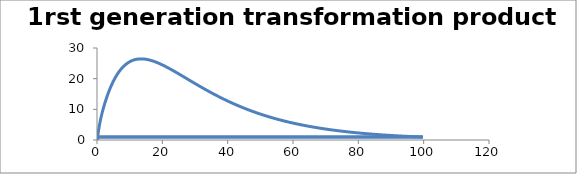
| Category | C - Sys 2 |
|---|---|
| 0.1 | 0 |
| 0.2 | 0.948 |
| 0.3 | 1.804 |
| 0.4 | 2.583 |
| 0.5 | 3.3 |
| 0.6 | 3.963 |
| 0.7000000000000001 | 4.582 |
| 0.8 | 5.163 |
| 0.9000000000000001 | 5.713 |
| 1.0 | 6.236 |
| 1.0999999999999999 | 6.736 |
| 1.2 | 7.215 |
| 1.3 | 7.677 |
| 1.4000000000000001 | 8.123 |
| 1.5 | 8.556 |
| 1.6 | 8.976 |
| 1.7000000000000002 | 9.385 |
| 1.8000000000000003 | 9.784 |
| 1.9 | 10.174 |
| 2.0 | 10.554 |
| 2.1 | 10.926 |
| 2.1999999999999997 | 11.291 |
| 2.3 | 11.648 |
| 2.4 | 11.998 |
| 2.5 | 12.342 |
| 2.6 | 12.679 |
| 2.7 | 13.009 |
| 2.8000000000000003 | 13.334 |
| 2.9000000000000004 | 13.652 |
| 3.0 | 13.965 |
| 3.1 | 14.272 |
| 3.2 | 14.573 |
| 3.3000000000000003 | 14.869 |
| 3.4000000000000004 | 15.16 |
| 3.5000000000000004 | 15.445 |
| 3.6000000000000005 | 15.725 |
| 3.6999999999999997 | 16 |
| 3.8 | 16.27 |
| 3.9 | 16.535 |
| 4.0 | 16.795 |
| 4.1000000000000005 | 17.051 |
| 4.2 | 17.301 |
| 4.300000000000001 | 17.547 |
| 4.3999999999999995 | 17.789 |
| 4.5 | 18.025 |
| 4.6 | 18.258 |
| 4.7 | 18.485 |
| 4.8 | 18.709 |
| 4.9 | 18.928 |
| 5.0 | 19.143 |
| 5.1000000000000005 | 19.354 |
| 5.2 | 19.56 |
| 5.3 | 19.763 |
| 5.4 | 19.961 |
| 5.5 | 20.155 |
| 5.6000000000000005 | 20.346 |
| 5.7 | 20.532 |
| 5.800000000000001 | 20.715 |
| 5.9 | 20.894 |
| 6.0 | 21.069 |
| 6.1 | 21.241 |
| 6.2 | 21.408 |
| 6.3 | 21.573 |
| 6.4 | 21.733 |
| 6.5 | 21.891 |
| 6.6000000000000005 | 22.044 |
| 6.7 | 22.195 |
| 6.800000000000001 | 22.342 |
| 6.9 | 22.485 |
| 7.000000000000001 | 22.626 |
| 7.1000000000000005 | 22.763 |
| 7.200000000000001 | 22.897 |
| 7.3 | 23.028 |
| 7.3999999999999995 | 23.155 |
| 7.5 | 23.28 |
| 7.6 | 23.402 |
| 7.7 | 23.52 |
| 7.8 | 23.636 |
| 7.9 | 23.749 |
| 8.0 | 23.859 |
| 8.1 | 23.966 |
| 8.200000000000001 | 24.07 |
| 8.3 | 24.172 |
| 8.4 | 24.27 |
| 8.5 | 24.367 |
| 8.600000000000001 | 24.46 |
| 8.700000000000001 | 24.551 |
| 8.799999999999999 | 24.639 |
| 8.9 | 24.725 |
| 9.0 | 24.808 |
| 9.1 | 24.889 |
| 9.2 | 24.968 |
| 9.3 | 25.044 |
| 9.4 | 25.117 |
| 9.5 | 25.188 |
| 9.6 | 25.257 |
| 9.700000000000001 | 25.324 |
| 9.8 | 25.389 |
| 9.9 | 25.451 |
| 10.0 | 25.511 |
| 10.100000000000001 | 25.569 |
| 10.200000000000001 | 25.625 |
| 10.3 | 25.678 |
| 10.4 | 25.73 |
| 10.5 | 25.78 |
| 10.6 | 25.827 |
| 10.7 | 25.873 |
| 10.8 | 25.917 |
| 10.9 | 25.959 |
| 11.0 | 25.998 |
| 11.1 | 26.037 |
| 11.200000000000001 | 26.073 |
| 11.3 | 26.107 |
| 11.4 | 26.14 |
| 11.5 | 26.171 |
| 11.600000000000001 | 26.2 |
| 11.700000000000001 | 26.227 |
| 11.8 | 26.253 |
| 11.9 | 26.277 |
| 12.0 | 26.299 |
| 12.1 | 26.32 |
| 12.2 | 26.339 |
| 12.3 | 26.357 |
| 12.4 | 26.373 |
| 12.5 | 26.388 |
| 12.6 | 26.401 |
| 12.7 | 26.413 |
| 12.8 | 26.423 |
| 12.9 | 26.431 |
| 13.0 | 26.439 |
| 13.100000000000001 | 26.445 |
| 13.200000000000001 | 26.449 |
| 13.3 | 26.453 |
| 13.4 | 26.455 |
| 13.5 | 26.455 |
| 13.600000000000001 | 26.454 |
| 13.700000000000001 | 26.453 |
| 13.8 | 26.449 |
| 13.900000000000002 | 26.445 |
| 14.000000000000002 | 26.439 |
| 14.100000000000001 | 26.433 |
| 14.200000000000001 | 26.425 |
| 14.3 | 26.415 |
| 14.400000000000002 | 26.405 |
| 14.499999999999998 | 26.394 |
| 14.6 | 26.381 |
| 14.7 | 26.368 |
| 14.799999999999999 | 26.353 |
| 14.899999999999999 | 26.337 |
| 15.0 | 26.321 |
| 15.1 | 26.303 |
| 15.2 | 26.284 |
| 15.299999999999999 | 26.264 |
| 15.4 | 26.244 |
| 15.5 | 26.222 |
| 15.6 | 26.2 |
| 15.7 | 26.176 |
| 15.8 | 26.152 |
| 15.9 | 26.126 |
| 16.0 | 26.1 |
| 16.1 | 26.073 |
| 16.2 | 26.045 |
| 16.3 | 26.017 |
| 16.400000000000002 | 25.987 |
| 16.5 | 25.957 |
| 16.6 | 25.926 |
| 16.7 | 25.894 |
| 16.8 | 25.861 |
| 16.900000000000002 | 25.828 |
| 17.0 | 25.794 |
| 17.1 | 25.759 |
| 17.200000000000003 | 25.723 |
| 17.3 | 25.687 |
| 17.400000000000002 | 25.65 |
| 17.5 | 25.612 |
| 17.599999999999998 | 25.574 |
| 17.7 | 25.535 |
| 17.8 | 25.496 |
| 17.9 | 25.455 |
| 18.0 | 25.414 |
| 18.099999999999998 | 25.373 |
| 18.2 | 25.331 |
| 18.3 | 25.288 |
| 18.4 | 25.245 |
| 18.5 | 25.202 |
| 18.6 | 25.157 |
| 18.7 | 25.112 |
| 18.8 | 25.067 |
| 18.9 | 25.021 |
| 19.0 | 24.975 |
| 19.1 | 24.928 |
| 19.2 | 24.881 |
| 19.3 | 24.833 |
| 19.400000000000002 | 24.785 |
| 19.5 | 24.736 |
| 19.6 | 24.687 |
| 19.7 | 24.637 |
| 19.8 | 24.587 |
| 19.900000000000002 | 24.536 |
| 20.0 | 24.485 |
| 20.1 | 24.434 |
| 20.200000000000003 | 24.382 |
| 20.3 | 24.33 |
| 20.400000000000002 | 24.278 |
| 20.5 | 24.225 |
| 20.6 | 24.172 |
| 20.700000000000003 | 24.118 |
| 20.8 | 24.064 |
| 20.9 | 24.01 |
| 21.0 | 23.955 |
| 21.099999999999998 | 23.9 |
| 21.2 | 23.845 |
| 21.3 | 23.79 |
| 21.4 | 23.734 |
| 21.5 | 23.678 |
| 21.6 | 23.621 |
| 21.7 | 23.565 |
| 21.8 | 23.508 |
| 21.9 | 23.45 |
| 22.0 | 23.393 |
| 22.1 | 23.335 |
| 22.2 | 23.277 |
| 22.3 | 23.219 |
| 22.400000000000002 | 23.16 |
| 22.5 | 23.102 |
| 22.6 | 23.043 |
| 22.7 | 22.984 |
| 22.8 | 22.924 |
| 22.900000000000002 | 22.865 |
| 23.0 | 22.805 |
| 23.1 | 22.745 |
| 23.200000000000003 | 22.685 |
| 23.3 | 22.625 |
| 23.400000000000002 | 22.564 |
| 23.5 | 22.504 |
| 23.6 | 22.443 |
| 23.700000000000003 | 22.382 |
| 23.8 | 22.321 |
| 23.900000000000002 | 22.26 |
| 24.0 | 22.198 |
| 24.099999999999998 | 22.137 |
| 24.2 | 22.075 |
| 24.3 | 22.014 |
| 24.4 | 21.952 |
| 24.5 | 21.89 |
| 24.6 | 21.828 |
| 24.7 | 21.765 |
| 24.8 | 21.703 |
| 24.9 | 21.641 |
| 25.0 | 21.578 |
| 25.1 | 21.516 |
| 25.2 | 21.453 |
| 25.3 | 21.39 |
| 25.4 | 21.327 |
| 25.5 | 21.264 |
| 25.6 | 21.201 |
| 25.7 | 21.138 |
| 25.8 | 21.075 |
| 25.900000000000002 | 21.012 |
| 26.0 | 20.949 |
| 26.1 | 20.886 |
| 26.200000000000003 | 20.823 |
| 26.3 | 20.759 |
| 26.400000000000002 | 20.696 |
| 26.5 | 20.632 |
| 26.6 | 20.569 |
| 26.700000000000003 | 20.506 |
| 26.8 | 20.442 |
| 26.900000000000002 | 20.379 |
| 27.0 | 20.315 |
| 27.1 | 20.252 |
| 27.200000000000003 | 20.188 |
| 27.3 | 20.125 |
| 27.400000000000002 | 20.061 |
| 27.500000000000004 | 19.998 |
| 27.6 | 19.934 |
| 27.700000000000003 | 19.871 |
| 27.800000000000004 | 19.807 |
| 27.900000000000002 | 19.744 |
| 28.000000000000004 | 19.68 |
| 28.1 | 19.617 |
| 28.200000000000003 | 19.553 |
| 28.300000000000004 | 19.49 |
| 28.400000000000002 | 19.426 |
| 28.500000000000004 | 19.363 |
| 28.6 | 19.3 |
| 28.700000000000003 | 19.236 |
| 28.800000000000004 | 19.173 |
| 28.9 | 19.11 |
| 28.999999999999996 | 19.047 |
| 29.099999999999998 | 18.984 |
| 29.2 | 18.921 |
| 29.299999999999997 | 18.858 |
| 29.4 | 18.795 |
| 29.5 | 18.732 |
| 29.599999999999998 | 18.669 |
| 29.7 | 18.606 |
| 29.799999999999997 | 18.543 |
| 29.9 | 18.481 |
| 30.0 | 18.418 |
| 30.099999999999998 | 18.356 |
| 30.2 | 18.293 |
| 30.3 | 18.231 |
| 30.4 | 18.168 |
| 30.5 | 18.106 |
| 30.599999999999998 | 18.044 |
| 30.7 | 17.982 |
| 30.8 | 17.92 |
| 30.9 | 17.858 |
| 31.0 | 17.796 |
| 31.1 | 17.734 |
| 31.2 | 17.672 |
| 31.3 | 17.611 |
| 31.4 | 17.549 |
| 31.5 | 17.488 |
| 31.6 | 17.427 |
| 31.7 | 17.365 |
| 31.8 | 17.304 |
| 31.900000000000002 | 17.243 |
| 32.0 | 17.182 |
| 32.1 | 17.121 |
| 32.2 | 17.061 |
| 32.300000000000004 | 17 |
| 32.4 | 16.939 |
| 32.5 | 16.879 |
| 32.6 | 16.819 |
| 32.7 | 16.758 |
| 32.800000000000004 | 16.698 |
| 32.9 | 16.638 |
| 33.0 | 16.579 |
| 33.1 | 16.519 |
| 33.2 | 16.459 |
| 33.300000000000004 | 16.4 |
| 33.4 | 16.34 |
| 33.5 | 16.281 |
| 33.6 | 16.222 |
| 33.7 | 16.163 |
| 33.800000000000004 | 16.104 |
| 33.900000000000006 | 16.045 |
| 34.0 | 15.986 |
| 34.1 | 15.928 |
| 34.2 | 15.869 |
| 34.300000000000004 | 15.811 |
| 34.400000000000006 | 15.753 |
| 34.5 | 15.695 |
| 34.6 | 15.637 |
| 34.7 | 15.579 |
| 34.800000000000004 | 15.521 |
| 34.900000000000006 | 15.464 |
| 35.0 | 15.406 |
| 35.1 | 15.349 |
| 35.199999999999996 | 15.292 |
| 35.3 | 15.235 |
| 35.4 | 15.178 |
| 35.5 | 15.121 |
| 35.6 | 15.065 |
| 35.699999999999996 | 15.008 |
| 35.8 | 14.952 |
| 35.9 | 14.896 |
| 36.0 | 14.839 |
| 36.1 | 14.784 |
| 36.199999999999996 | 14.728 |
| 36.3 | 14.672 |
| 36.4 | 14.617 |
| 36.5 | 14.561 |
| 36.6 | 14.506 |
| 36.7 | 14.451 |
| 36.8 | 14.396 |
| 36.9 | 14.341 |
| 37.0 | 14.287 |
| 37.1 | 14.232 |
| 37.2 | 14.178 |
| 37.3 | 14.124 |
| 37.4 | 14.07 |
| 37.5 | 14.016 |
| 37.6 | 13.962 |
| 37.7 | 13.908 |
| 37.8 | 13.855 |
| 37.9 | 13.801 |
| 38.0 | 13.748 |
| 38.1 | 13.695 |
| 38.2 | 13.642 |
| 38.3 | 13.59 |
| 38.4 | 13.537 |
| 38.5 | 13.485 |
| 38.6 | 13.432 |
| 38.7 | 13.38 |
| 38.800000000000004 | 13.328 |
| 38.9 | 13.276 |
| 39.0 | 13.225 |
| 39.1 | 13.173 |
| 39.2 | 13.122 |
| 39.300000000000004 | 13.07 |
| 39.4 | 13.019 |
| 39.5 | 12.968 |
| 39.6 | 12.918 |
| 39.7 | 12.867 |
| 39.800000000000004 | 12.817 |
| 39.900000000000006 | 12.766 |
| 40.0 | 12.716 |
| 40.1 | 12.666 |
| 40.2 | 12.616 |
| 40.300000000000004 | 12.566 |
| 40.400000000000006 | 12.517 |
| 40.5 | 12.467 |
| 40.6 | 12.418 |
| 40.7 | 12.369 |
| 40.800000000000004 | 12.32 |
| 40.900000000000006 | 12.271 |
| 41.0 | 12.223 |
| 41.1 | 12.174 |
| 41.2 | 12.126 |
| 41.300000000000004 | 12.078 |
| 41.400000000000006 | 12.03 |
| 41.5 | 11.982 |
| 41.6 | 11.934 |
| 41.699999999999996 | 11.886 |
| 41.8 | 11.839 |
| 41.9 | 11.792 |
| 42.0 | 11.744 |
| 42.1 | 11.697 |
| 42.199999999999996 | 11.651 |
| 42.3 | 11.604 |
| 42.4 | 11.557 |
| 42.5 | 11.511 |
| 42.6 | 11.465 |
| 42.699999999999996 | 11.419 |
| 42.8 | 11.373 |
| 42.9 | 11.327 |
| 43.0 | 11.282 |
| 43.1 | 11.236 |
| 43.2 | 11.191 |
| 43.3 | 11.146 |
| 43.4 | 11.101 |
| 43.5 | 11.056 |
| 43.6 | 11.011 |
| 43.7 | 10.966 |
| 43.8 | 10.922 |
| 43.9 | 10.878 |
| 44.0 | 10.834 |
| 44.1 | 10.79 |
| 44.2 | 10.746 |
| 44.3 | 10.702 |
| 44.4 | 10.659 |
| 44.5 | 10.615 |
| 44.6 | 10.572 |
| 44.7 | 10.529 |
| 44.800000000000004 | 10.486 |
| 44.9 | 10.444 |
| 45.0 | 10.401 |
| 45.1 | 10.358 |
| 45.2 | 10.316 |
| 45.300000000000004 | 10.274 |
| 45.4 | 10.232 |
| 45.5 | 10.19 |
| 45.6 | 10.148 |
| 45.7 | 10.107 |
| 45.800000000000004 | 10.065 |
| 45.9 | 10.024 |
| 46.0 | 9.983 |
| 46.1 | 9.942 |
| 46.2 | 9.901 |
| 46.300000000000004 | 9.86 |
| 46.400000000000006 | 9.82 |
| 46.5 | 9.779 |
| 46.6 | 9.739 |
| 46.7 | 9.699 |
| 46.800000000000004 | 9.659 |
| 46.900000000000006 | 9.619 |
| 47.0 | 9.58 |
| 47.1 | 9.54 |
| 47.2 | 9.501 |
| 47.300000000000004 | 9.461 |
| 47.400000000000006 | 9.422 |
| 47.5 | 9.383 |
| 47.6 | 9.344 |
| 47.7 | 9.306 |
| 47.800000000000004 | 9.267 |
| 47.900000000000006 | 9.229 |
| 48.0 | 9.19 |
| 48.1 | 9.152 |
| 48.199999999999996 | 9.114 |
| 48.3 | 9.077 |
| 48.4 | 9.039 |
| 48.5 | 9.001 |
| 48.6 | 8.964 |
| 48.699999999999996 | 8.926 |
| 48.8 | 8.889 |
| 48.9 | 8.852 |
| 49.0 | 8.815 |
| 49.1 | 8.779 |
| 49.2 | 8.742 |
| 49.3 | 8.706 |
| 49.4 | 8.669 |
| 49.5 | 8.633 |
| 49.6 | 8.597 |
| 49.7 | 8.561 |
| 49.8 | 8.525 |
| 49.9 | 8.49 |
| 50.0 | 8.454 |
| 50.1 | 8.419 |
| 50.2 | 8.383 |
| 50.3 | 8.348 |
| 50.4 | 8.313 |
| 50.5 | 8.279 |
| 50.6 | 8.244 |
| 50.7 | 8.209 |
| 50.8 | 8.175 |
| 50.9 | 8.14 |
| 51.0 | 8.106 |
| 51.1 | 8.072 |
| 51.2 | 8.038 |
| 51.300000000000004 | 8.004 |
| 51.4 | 7.971 |
| 51.5 | 7.937 |
| 51.6 | 7.904 |
| 51.7 | 7.87 |
| 51.800000000000004 | 7.837 |
| 51.9 | 7.804 |
| 52.0 | 7.771 |
| 52.1 | 7.739 |
| 52.2 | 7.706 |
| 52.300000000000004 | 7.673 |
| 52.400000000000006 | 7.641 |
| 52.5 | 7.609 |
| 52.6 | 7.577 |
| 52.7 | 7.545 |
| 52.800000000000004 | 7.513 |
| 52.900000000000006 | 7.481 |
| 53.0 | 7.449 |
| 53.1 | 7.418 |
| 53.2 | 7.386 |
| 53.300000000000004 | 7.355 |
| 53.400000000000006 | 7.324 |
| 53.5 | 7.293 |
| 53.6 | 7.262 |
| 53.7 | 7.231 |
| 53.800000000000004 | 7.2 |
| 53.900000000000006 | 7.17 |
| 54.0 | 7.139 |
| 54.1 | 7.109 |
| 54.2 | 7.079 |
| 54.300000000000004 | 7.049 |
| 54.400000000000006 | 7.019 |
| 54.50000000000001 | 6.989 |
| 54.6 | 6.959 |
| 54.7 | 6.93 |
| 54.800000000000004 | 6.9 |
| 54.900000000000006 | 6.871 |
| 55.00000000000001 | 6.842 |
| 55.1 | 6.812 |
| 55.2 | 6.783 |
| 55.300000000000004 | 6.755 |
| 55.400000000000006 | 6.726 |
| 55.50000000000001 | 6.697 |
| 55.60000000000001 | 6.669 |
| 55.7 | 6.64 |
| 55.800000000000004 | 6.612 |
| 55.900000000000006 | 6.584 |
| 56.00000000000001 | 6.555 |
| 56.10000000000001 | 6.527 |
| 56.2 | 6.5 |
| 56.300000000000004 | 6.472 |
| 56.400000000000006 | 6.444 |
| 56.50000000000001 | 6.417 |
| 56.60000000000001 | 6.389 |
| 56.7 | 6.362 |
| 56.800000000000004 | 6.335 |
| 56.900000000000006 | 6.307 |
| 57.00000000000001 | 6.28 |
| 57.10000000000001 | 6.254 |
| 57.2 | 6.227 |
| 57.300000000000004 | 6.2 |
| 57.400000000000006 | 6.174 |
| 57.50000000000001 | 6.147 |
| 57.60000000000001 | 6.121 |
| 57.699999999999996 | 6.095 |
| 57.8 | 6.068 |
| 57.9 | 6.042 |
| 57.99999999999999 | 6.016 |
| 58.099999999999994 | 5.991 |
| 58.199999999999996 | 5.965 |
| 58.3 | 5.939 |
| 58.4 | 5.914 |
| 58.5 | 5.888 |
| 58.599999999999994 | 5.863 |
| 58.699999999999996 | 5.838 |
| 58.8 | 5.813 |
| 58.9 | 5.788 |
| 59.0 | 5.763 |
| 59.099999999999994 | 5.738 |
| 59.199999999999996 | 5.713 |
| 59.3 | 5.689 |
| 59.4 | 5.664 |
| 59.5 | 5.64 |
| 59.599999999999994 | 5.616 |
| 59.699999999999996 | 5.591 |
| 59.8 | 5.567 |
| 59.9 | 5.543 |
| 60.0 | 5.52 |
| 60.099999999999994 | 5.496 |
| 60.199999999999996 | 5.472 |
| 60.3 | 5.448 |
| 60.4 | 5.425 |
| 60.5 | 5.402 |
| 60.6 | 5.378 |
| 60.699999999999996 | 5.355 |
| 60.8 | 5.332 |
| 60.9 | 5.309 |
| 61.0 | 5.286 |
| 61.1 | 5.263 |
| 61.199999999999996 | 5.24 |
| 61.3 | 5.218 |
| 61.4 | 5.195 |
| 61.5 | 5.173 |
| 61.6 | 5.15 |
| 61.7 | 5.128 |
| 61.8 | 5.106 |
| 61.9 | 5.084 |
| 62.0 | 5.062 |
| 62.1 | 5.04 |
| 62.2 | 5.018 |
| 62.3 | 4.996 |
| 62.4 | 4.975 |
| 62.5 | 4.953 |
| 62.6 | 4.932 |
| 62.7 | 4.91 |
| 62.8 | 4.889 |
| 62.9 | 4.868 |
| 63.0 | 4.847 |
| 63.1 | 4.826 |
| 63.2 | 4.805 |
| 63.3 | 4.784 |
| 63.4 | 4.763 |
| 63.5 | 4.743 |
| 63.6 | 4.722 |
| 63.7 | 4.702 |
| 63.800000000000004 | 4.681 |
| 63.9 | 4.661 |
| 64.0 | 4.641 |
| 64.1 | 4.621 |
| 64.2 | 4.601 |
| 64.3 | 4.581 |
| 64.4 | 4.561 |
| 64.5 | 4.541 |
| 64.60000000000001 | 4.521 |
| 64.7 | 4.502 |
| 64.8 | 4.482 |
| 64.9 | 4.462 |
| 65.0 | 4.443 |
| 65.10000000000001 | 4.424 |
| 65.2 | 4.405 |
| 65.3 | 4.385 |
| 65.4 | 4.366 |
| 65.5 | 4.347 |
| 65.60000000000001 | 4.328 |
| 65.7 | 4.31 |
| 65.8 | 4.291 |
| 65.9 | 4.272 |
| 66.0 | 4.254 |
| 66.10000000000001 | 4.235 |
| 66.2 | 4.217 |
| 66.3 | 4.198 |
| 66.4 | 4.18 |
| 66.5 | 4.162 |
| 66.60000000000001 | 4.144 |
| 66.7 | 4.126 |
| 66.8 | 4.108 |
| 66.9 | 4.09 |
| 67.0 | 4.072 |
| 67.10000000000001 | 4.054 |
| 67.2 | 4.036 |
| 67.30000000000001 | 4.019 |
| 67.4 | 4.001 |
| 67.5 | 3.984 |
| 67.60000000000001 | 3.967 |
| 67.7 | 3.949 |
| 67.80000000000001 | 3.932 |
| 67.9 | 3.915 |
| 68.0 | 3.898 |
| 68.10000000000001 | 3.881 |
| 68.2 | 3.864 |
| 68.30000000000001 | 3.847 |
| 68.4 | 3.83 |
| 68.5 | 3.813 |
| 68.60000000000001 | 3.797 |
| 68.7 | 3.78 |
| 68.80000000000001 | 3.764 |
| 68.9 | 3.747 |
| 69.0 | 3.731 |
| 69.10000000000001 | 3.715 |
| 69.2 | 3.698 |
| 69.30000000000001 | 3.682 |
| 69.4 | 3.666 |
| 69.5 | 3.65 |
| 69.60000000000001 | 3.634 |
| 69.7 | 3.618 |
| 69.80000000000001 | 3.602 |
| 69.9 | 3.587 |
| 70.0 | 3.571 |
| 70.10000000000001 | 3.555 |
| 70.2 | 3.54 |
| 70.30000000000001 | 3.524 |
| 70.39999999999999 | 3.509 |
| 70.5 | 3.494 |
| 70.6 | 3.478 |
| 70.7 | 3.463 |
| 70.8 | 3.448 |
| 70.89999999999999 | 3.433 |
| 71.0 | 3.418 |
| 71.1 | 3.403 |
| 71.2 | 3.388 |
| 71.3 | 3.373 |
| 71.39999999999999 | 3.358 |
| 71.5 | 3.344 |
| 71.6 | 3.329 |
| 71.7 | 3.314 |
| 71.8 | 3.3 |
| 71.89999999999999 | 3.285 |
| 72.0 | 3.271 |
| 72.1 | 3.257 |
| 72.2 | 3.242 |
| 72.3 | 3.228 |
| 72.39999999999999 | 3.214 |
| 72.5 | 3.2 |
| 72.6 | 3.186 |
| 72.7 | 3.172 |
| 72.8 | 3.158 |
| 72.89999999999999 | 3.144 |
| 73.0 | 3.13 |
| 73.1 | 3.117 |
| 73.2 | 3.103 |
| 73.3 | 3.089 |
| 73.4 | 3.076 |
| 73.5 | 3.062 |
| 73.6 | 3.049 |
| 73.7 | 3.036 |
| 73.8 | 3.022 |
| 73.9 | 3.009 |
| 74.0 | 2.996 |
| 74.1 | 2.983 |
| 74.2 | 2.97 |
| 74.3 | 2.956 |
| 74.4 | 2.944 |
| 74.5 | 2.931 |
| 74.6 | 2.918 |
| 74.7 | 2.905 |
| 74.8 | 2.892 |
| 74.9 | 2.879 |
| 75.0 | 2.867 |
| 75.1 | 2.854 |
| 75.2 | 2.842 |
| 75.3 | 2.829 |
| 75.4 | 2.817 |
| 75.5 | 2.804 |
| 75.6 | 2.792 |
| 75.7 | 2.78 |
| 75.8 | 2.768 |
| 75.9 | 2.755 |
| 76.0 | 2.743 |
| 76.1 | 2.731 |
| 76.2 | 2.719 |
| 76.3 | 2.707 |
| 76.4 | 2.695 |
| 76.5 | 2.684 |
| 76.6 | 2.672 |
| 76.7 | 2.66 |
| 76.8 | 2.648 |
| 76.9 | 2.637 |
| 77.0 | 2.625 |
| 77.10000000000001 | 2.614 |
| 77.2 | 2.602 |
| 77.3 | 2.591 |
| 77.4 | 2.579 |
| 77.5 | 2.568 |
| 77.60000000000001 | 2.557 |
| 77.7 | 2.545 |
| 77.8 | 2.534 |
| 77.9 | 2.523 |
| 78.0 | 2.512 |
| 78.10000000000001 | 2.501 |
| 78.2 | 2.49 |
| 78.3 | 2.479 |
| 78.4 | 2.468 |
| 78.5 | 2.457 |
| 78.60000000000001 | 2.446 |
| 78.7 | 2.435 |
| 78.8 | 2.425 |
| 78.9 | 2.414 |
| 79.0 | 2.403 |
| 79.10000000000001 | 2.393 |
| 79.2 | 2.382 |
| 79.3 | 2.372 |
| 79.4 | 2.361 |
| 79.5 | 2.351 |
| 79.60000000000001 | 2.341 |
| 79.7 | 2.33 |
| 79.80000000000001 | 2.32 |
| 79.9 | 2.31 |
| 80.0 | 2.3 |
| 80.10000000000001 | 2.29 |
| 80.2 | 2.279 |
| 80.30000000000001 | 2.269 |
| 80.4 | 2.259 |
| 80.5 | 2.249 |
| 80.60000000000001 | 2.24 |
| 80.7 | 2.23 |
| 80.80000000000001 | 2.22 |
| 80.9 | 2.21 |
| 81.0 | 2.2 |
| 81.10000000000001 | 2.191 |
| 81.2 | 2.181 |
| 81.30000000000001 | 2.171 |
| 81.4 | 2.162 |
| 81.5 | 2.152 |
| 81.60000000000001 | 2.143 |
| 81.7 | 2.133 |
| 81.80000000000001 | 2.124 |
| 81.9 | 2.115 |
| 82.0 | 2.105 |
| 82.10000000000001 | 2.096 |
| 82.2 | 2.087 |
| 82.30000000000001 | 2.077 |
| 82.4 | 2.068 |
| 82.5 | 2.059 |
| 82.60000000000001 | 2.05 |
| 82.7 | 2.041 |
| 82.80000000000001 | 2.032 |
| 82.9 | 2.023 |
| 83.0 | 2.014 |
| 83.10000000000001 | 2.005 |
| 83.2 | 1.996 |
| 83.3 | 1.988 |
| 83.39999999999999 | 1.979 |
| 83.5 | 1.97 |
| 83.6 | 1.961 |
| 83.7 | 1.953 |
| 83.8 | 1.944 |
| 83.89999999999999 | 1.936 |
| 84.0 | 1.927 |
| 84.1 | 1.919 |
| 84.2 | 1.91 |
| 84.3 | 1.902 |
| 84.39999999999999 | 1.893 |
| 84.5 | 1.885 |
| 84.6 | 1.877 |
| 84.7 | 1.868 |
| 84.8 | 1.86 |
| 84.89999999999999 | 1.852 |
| 85.0 | 1.844 |
| 85.1 | 1.836 |
| 85.2 | 1.827 |
| 85.3 | 1.819 |
| 85.39999999999999 | 1.811 |
| 85.5 | 1.803 |
| 85.6 | 1.795 |
| 85.7 | 1.787 |
| 85.8 | 1.78 |
| 85.9 | 1.772 |
| 86.0 | 1.764 |
| 86.1 | 1.756 |
| 86.2 | 1.748 |
| 86.3 | 1.741 |
| 86.4 | 1.733 |
| 86.5 | 1.725 |
| 86.6 | 1.718 |
| 86.7 | 1.71 |
| 86.8 | 1.702 |
| 86.9 | 1.695 |
| 87.0 | 1.687 |
| 87.1 | 1.68 |
| 87.2 | 1.673 |
| 87.3 | 1.665 |
| 87.4 | 1.658 |
| 87.5 | 1.651 |
| 87.6 | 1.643 |
| 87.7 | 1.636 |
| 87.8 | 1.629 |
| 87.9 | 1.622 |
| 88.0 | 1.614 |
| 88.1 | 1.607 |
| 88.2 | 1.6 |
| 88.3 | 1.593 |
| 88.4 | 1.586 |
| 88.5 | 1.579 |
| 88.6 | 1.572 |
| 88.7 | 1.565 |
| 88.8 | 1.558 |
| 88.9 | 1.551 |
| 89.0 | 1.544 |
| 89.1 | 1.538 |
| 89.2 | 1.531 |
| 89.3 | 1.524 |
| 89.4 | 1.517 |
| 89.5 | 1.511 |
| 89.60000000000001 | 1.504 |
| 89.7 | 1.497 |
| 89.8 | 1.491 |
| 89.9 | 1.484 |
| 90.0 | 1.477 |
| 90.10000000000001 | 1.471 |
| 90.2 | 1.464 |
| 90.3 | 1.458 |
| 90.4 | 1.452 |
| 90.5 | 1.445 |
| 90.60000000000001 | 1.439 |
| 90.7 | 1.432 |
| 90.8 | 1.426 |
| 90.9 | 1.42 |
| 91.0 | 1.413 |
| 91.10000000000001 | 1.407 |
| 91.2 | 1.401 |
| 91.3 | 1.395 |
| 91.4 | 1.389 |
| 91.5 | 1.382 |
| 91.60000000000001 | 1.376 |
| 91.7 | 1.37 |
| 91.8 | 1.364 |
| 91.9 | 1.358 |
| 92.0 | 1.352 |
| 92.10000000000001 | 1.346 |
| 92.2 | 1.34 |
| 92.30000000000001 | 1.334 |
| 92.4 | 1.328 |
| 92.5 | 1.323 |
| 92.60000000000001 | 1.317 |
| 92.7 | 1.311 |
| 92.80000000000001 | 1.305 |
| 92.9 | 1.299 |
| 93.0 | 1.294 |
| 93.10000000000001 | 1.288 |
| 93.2 | 1.282 |
| 93.30000000000001 | 1.276 |
| 93.4 | 1.271 |
| 93.5 | 1.265 |
| 93.60000000000001 | 1.26 |
| 93.7 | 1.254 |
| 93.80000000000001 | 1.248 |
| 93.9 | 1.243 |
| 94.0 | 1.237 |
| 94.10000000000001 | 1.232 |
| 94.2 | 1.226 |
| 94.30000000000001 | 1.221 |
| 94.4 | 1.216 |
| 94.5 | 1.21 |
| 94.60000000000001 | 1.205 |
| 94.7 | 1.2 |
| 94.80000000000001 | 1.194 |
| 94.9 | 1.189 |
| 95.0 | 1.184 |
| 95.10000000000001 | 1.178 |
| 95.2 | 1.173 |
| 95.30000000000001 | 1.168 |
| 95.4 | 1.163 |
| 95.5 | 1.158 |
| 95.60000000000001 | 1.153 |
| 95.7 | 1.148 |
| 95.80000000000001 | 1.142 |
| 95.9 | 1.137 |
| 96.0 | 1.132 |
| 96.1 | 1.127 |
| 96.2 | 1.122 |
| 96.3 | 1.117 |
| 96.39999999999999 | 1.112 |
| 96.5 | 1.108 |
| 96.6 | 1.103 |
| 96.7 | 1.098 |
| 96.8 | 1.093 |
| 96.89999999999999 | 1.088 |
| 97.0 | 1.083 |
| 97.1 | 1.078 |
| 97.2 | 1.074 |
| 97.3 | 1.069 |
| 97.39999999999999 | 1.064 |
| 97.5 | 1.059 |
| 97.6 | 1.055 |
| 97.7 | 1.05 |
| 97.8 | 1.045 |
| 97.89999999999999 | 1.041 |
| 98.0 | 1.036 |
| 98.1 | 1.032 |
| 98.2 | 1.027 |
| 98.3 | 1.023 |
| 98.4 | 1.018 |
| 98.5 | 1.013 |
| 98.6 | 1.009 |
| 98.7 | 1.005 |
| 98.8 | 1 |
| 98.9 | 0.996 |
| 99.0 | 0.991 |
| 99.1 | 0.987 |
| 99.2 | 0.982 |
| 99.3 | 0.978 |
| 99.4 | 0.974 |
| 99.5 | 0.969 |
| 99.6 | 0.965 |
| 99.7 | 0.961 |
| 99.8 | 0.957 |
| 99.9 | 0.952 |
| 100.0 | 0.948 |